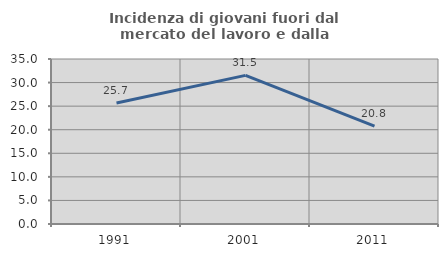
| Category | Incidenza di giovani fuori dal mercato del lavoro e dalla formazione  |
|---|---|
| 1991.0 | 25.682 |
| 2001.0 | 31.528 |
| 2011.0 | 20.77 |